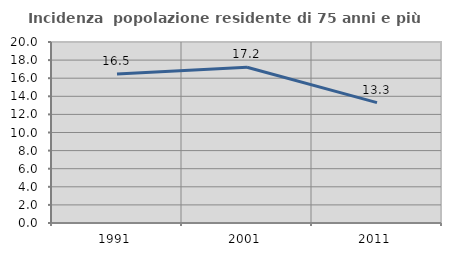
| Category | Incidenza  popolazione residente di 75 anni e più |
|---|---|
| 1991.0 | 16.456 |
| 2001.0 | 17.204 |
| 2011.0 | 13.306 |